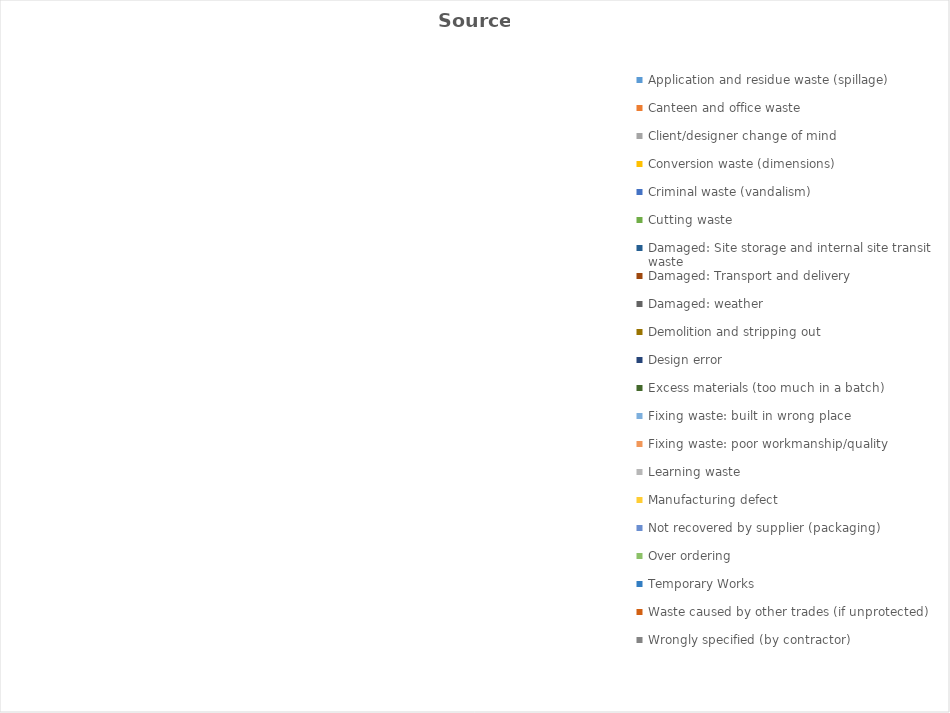
| Category | Volume |
|---|---|
| Application and residue waste (spillage) | 0 |
| Canteen and office waste | 0 |
| Client/designer change of mind | 0 |
| Conversion waste (dimensions) | 0 |
| Criminal waste (vandalism) | 0 |
| Cutting waste | 0 |
| Damaged: Site storage and internal site transit waste | 0 |
| Damaged: Transport and delivery | 0 |
| Damaged: weather | 0 |
| Demolition and stripping out | 0 |
| Design error | 0 |
| Excess materials (too much in a batch) | 0 |
| Fixing waste: built in wrong place | 0 |
| Fixing waste: poor workmanship/quality | 0 |
| Learning waste | 0 |
| Manufacturing defect | 0 |
| Not recovered by supplier (packaging) | 0 |
| Over ordering | 0 |
| Temporary Works | 0 |
| Waste caused by other trades (if unprotected) | 0 |
| Wrongly specified (by contractor) | 0 |